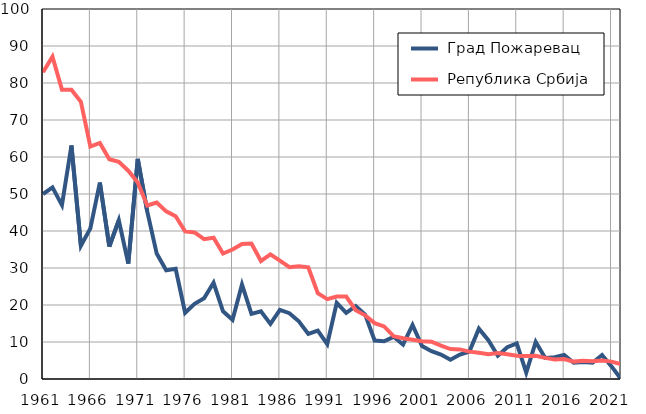
| Category |  Град Пожаревац |  Република Србија |
|---|---|---|
| 1961.0 | 50 | 82.9 |
| 1962.0 | 51.8 | 87.1 |
| 1963.0 | 47 | 78.2 |
| 1964.0 | 63.1 | 78.2 |
| 1965.0 | 36 | 74.9 |
| 1966.0 | 40.7 | 62.8 |
| 1967.0 | 53.1 | 63.8 |
| 1968.0 | 35.8 | 59.4 |
| 1969.0 | 42.9 | 58.7 |
| 1970.0 | 31.2 | 56.3 |
| 1971.0 | 59.5 | 53.1 |
| 1972.0 | 45.3 | 46.9 |
| 1973.0 | 33.9 | 47.7 |
| 1974.0 | 29.4 | 45.3 |
| 1975.0 | 29.8 | 44 |
| 1976.0 | 17.9 | 39.9 |
| 1977.0 | 20.3 | 39.6 |
| 1978.0 | 21.8 | 37.8 |
| 1979.0 | 26 | 38.2 |
| 1980.0 | 18.3 | 33.9 |
| 1981.0 | 16 | 35 |
| 1982.0 | 25.5 | 36.5 |
| 1983.0 | 17.6 | 36.6 |
| 1984.0 | 18.3 | 31.9 |
| 1985.0 | 14.9 | 33.7 |
| 1986.0 | 18.7 | 32 |
| 1987.0 | 17.8 | 30.2 |
| 1988.0 | 15.6 | 30.5 |
| 1989.0 | 12.2 | 30.2 |
| 1990.0 | 13.1 | 23.2 |
| 1991.0 | 9.4 | 21.6 |
| 1992.0 | 20.6 | 22.3 |
| 1993.0 | 17.9 | 22.3 |
| 1994.0 | 19.7 | 18.6 |
| 1995.0 | 17.4 | 17.2 |
| 1996.0 | 10.4 | 15.1 |
| 1997.0 | 10.2 | 14.2 |
| 1998.0 | 11.4 | 11.6 |
| 1999.0 | 9.3 | 11 |
| 2000.0 | 14.6 | 10.6 |
| 2001.0 | 8.9 | 10.2 |
| 2002.0 | 7.5 | 10.1 |
| 2003.0 | 6.6 | 9 |
| 2004.0 | 5.2 | 8.1 |
| 2005.0 | 6.6 | 8 |
| 2006.0 | 7.4 | 7.4 |
| 2007.0 | 13.6 | 7.1 |
| 2008.0 | 10.5 | 6.7 |
| 2009.0 | 6.3 | 7 |
| 2010.0 | 8.6 | 6.7 |
| 2011.0 | 9.6 | 6.3 |
| 2012.0 | 1.7 | 6.2 |
| 2013.0 | 10 | 6.3 |
| 2014.0 | 5.7 | 5.7 |
| 2015.0 | 5.9 | 5.3 |
| 2016.0 | 6.5 | 5.4 |
| 2017.0 | 4.4 | 4.7 |
| 2018.0 | 4.6 | 4.9 |
| 2019.0 | 4.4 | 4.8 |
| 2020.0 | 6.5 | 5 |
| 2021.0 | 3.4 | 4.7 |
| 2022.0 | 0 | 4 |